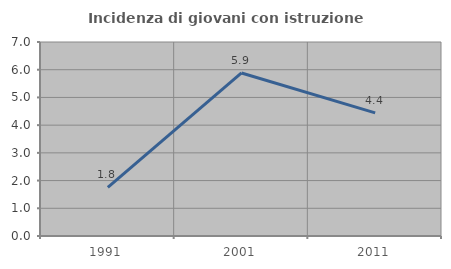
| Category | Incidenza di giovani con istruzione universitaria |
|---|---|
| 1991.0 | 1.754 |
| 2001.0 | 5.882 |
| 2011.0 | 4.444 |